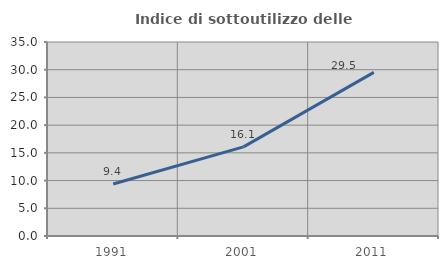
| Category | Indice di sottoutilizzo delle abitazioni  |
|---|---|
| 1991.0 | 9.386 |
| 2001.0 | 16.08 |
| 2011.0 | 29.513 |